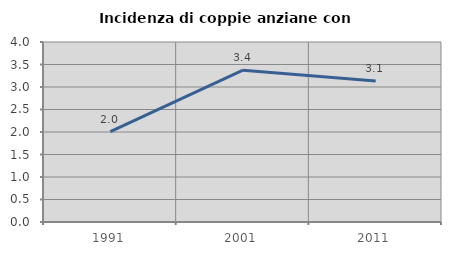
| Category | Incidenza di coppie anziane con figli |
|---|---|
| 1991.0 | 2.007 |
| 2001.0 | 3.374 |
| 2011.0 | 3.135 |